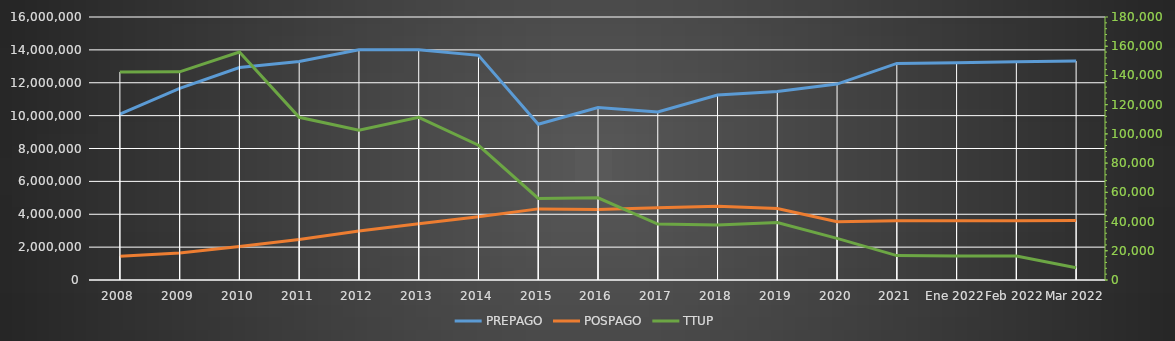
| Category | PREPAGO | POSPAGO |
|---|---|---|
| 2008 | 10097768 | 1452088 |
| 2009 | 11662294 | 1649838 |
| 2010 | 12929040 | 2033814 |
| 2011 | 13295834 | 2467378 |
| 2012 | 14008104 | 2976194 |
| 2013 | 14005126 | 3425277 |
| 2014 | 13666071 | 3846271 |
| 2015 | 9476240 | 4326937 |
| 2016 | 10498467 | 4293426 |
| 2017 | 10219457 | 4393703 |
| 2018 | 11254168 | 4480975 |
| 2019 | 11462048 | 4351686 |
| 2020 | 11917697 | 3539192 |
| 2021 | 13174530 | 3598383 |
| Ene 2022 | 13220510 | 3611202 |
| Feb 2022 | 13277237 | 3612124 |
| Mar 2022 | 13319621 | 3621700 |